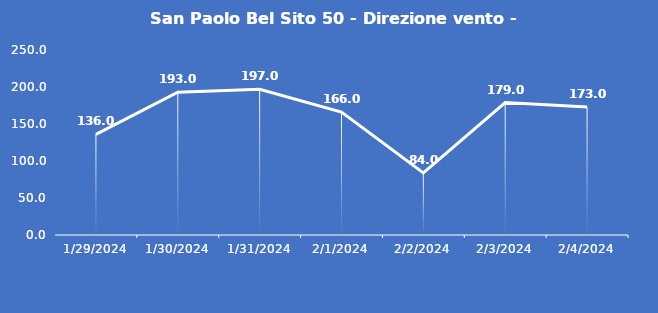
| Category | San Paolo Bel Sito 50 - Direzione vento - Grezzo (°N) |
|---|---|
| 1/29/24 | 136 |
| 1/30/24 | 193 |
| 1/31/24 | 197 |
| 2/1/24 | 166 |
| 2/2/24 | 84 |
| 2/3/24 | 179 |
| 2/4/24 | 173 |